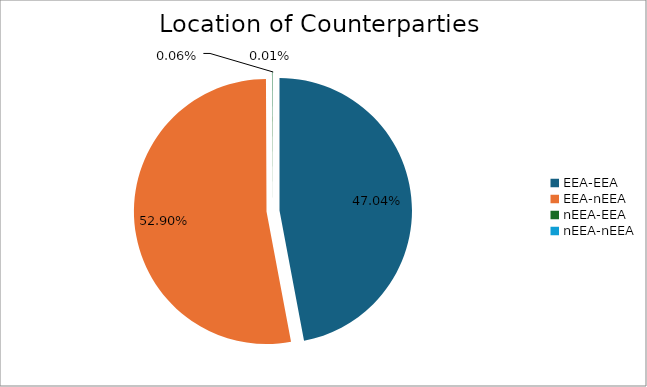
| Category | Series 0 |
|---|---|
| EEA-EEA | 6745286.142 |
| EEA-nEEA | 7586156.263 |
| nEEA-EEA | 8623.469 |
| nEEA-nEEA | 777.686 |